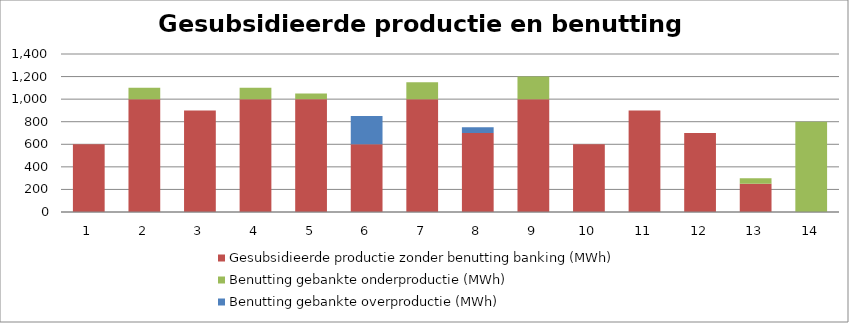
| Category | Gesubsidieerde productie zonder benutting banking (MWh) | Benutting gebankte onderproductie (MWh) | Benutting gebankte overproductie (MWh) |
|---|---|---|---|
| 0 | 600 | 0 | 0 |
| 1 | 1000 | 100 | 0 |
| 2 | 900 | 0 | 0 |
| 3 | 1000 | 100 | 0 |
| 4 | 1000 | 50 | 0 |
| 5 | 600 | 0 | 250 |
| 6 | 1000 | 150 | 0 |
| 7 | 700 | 0 | 50 |
| 8 | 1000 | 200 | 0 |
| 9 | 600 | 0 | 0 |
| 10 | 900 | 0 | 0 |
| 11 | 700 | 0 | 0 |
| 12 | 250 | 50 | 0 |
| 13 | 0 | 800 | 0 |